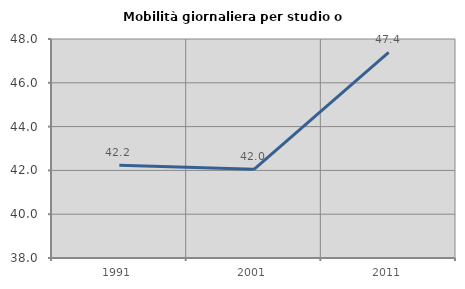
| Category | Mobilità giornaliera per studio o lavoro |
|---|---|
| 1991.0 | 42.236 |
| 2001.0 | 42.049 |
| 2011.0 | 47.385 |